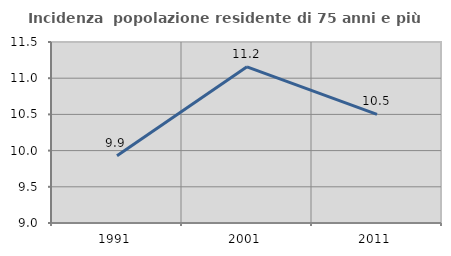
| Category | Incidenza  popolazione residente di 75 anni e più |
|---|---|
| 1991.0 | 9.93 |
| 2001.0 | 11.157 |
| 2011.0 | 10.499 |